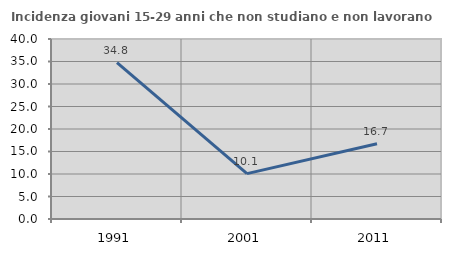
| Category | Incidenza giovani 15-29 anni che non studiano e non lavorano  |
|---|---|
| 1991.0 | 34.752 |
| 2001.0 | 10.092 |
| 2011.0 | 16.704 |